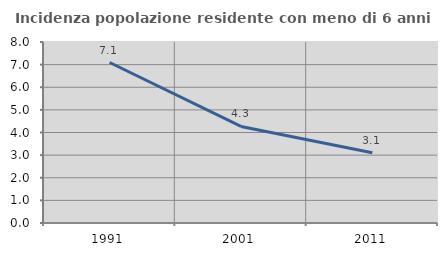
| Category | Incidenza popolazione residente con meno di 6 anni |
|---|---|
| 1991.0 | 7.094 |
| 2001.0 | 4.267 |
| 2011.0 | 3.101 |